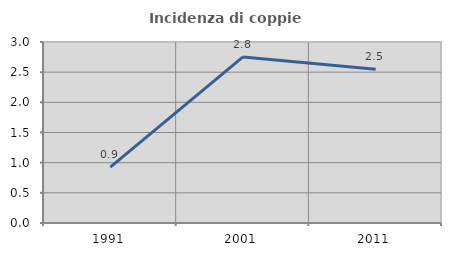
| Category | Incidenza di coppie miste |
|---|---|
| 1991.0 | 0.926 |
| 2001.0 | 2.752 |
| 2011.0 | 2.548 |